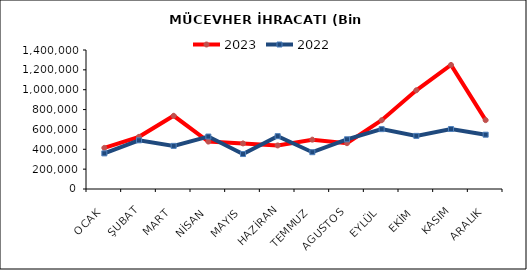
| Category | 2023 | 2022 |
|---|---|---|
| OCAK | 414228.297 | 358702.972 |
| ŞUBAT | 525446.515 | 490368.092 |
| MART | 737508.56 | 434421.482 |
| NİSAN | 477350.153 | 528467.88 |
| MAYIS | 459139.966 | 352195.34 |
| HAZİRAN | 438773.85 | 532181.444 |
| TEMMUZ | 496892.454 | 370694.847 |
| AGUSTOS | 461418.688 | 500628.327 |
| EYLÜL | 692706.082 | 602816.767 |
| EKİM | 994343.911 | 534980.293 |
| KASIM | 1249330.078 | 604023.044 |
| ARALIK | 693498.318 | 547013.788 |